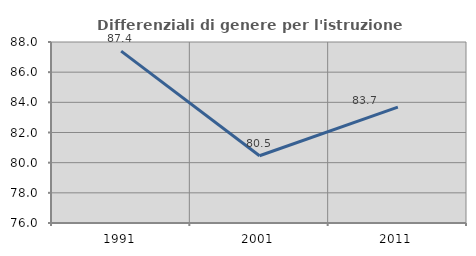
| Category | Differenziali di genere per l'istruzione superiore |
|---|---|
| 1991.0 | 87.398 |
| 2001.0 | 80.461 |
| 2011.0 | 83.682 |